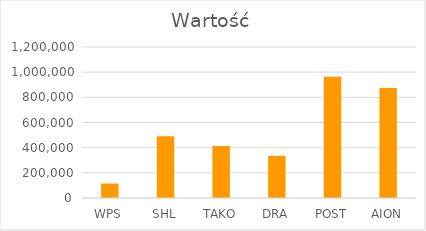
| Category | Wartość |
|---|---|
| WPS | 115000 |
| SHL | 489950 |
| TAKO | 412686 |
| DRA | 334600 |
| POST | 963390 |
| AION | 873290 |